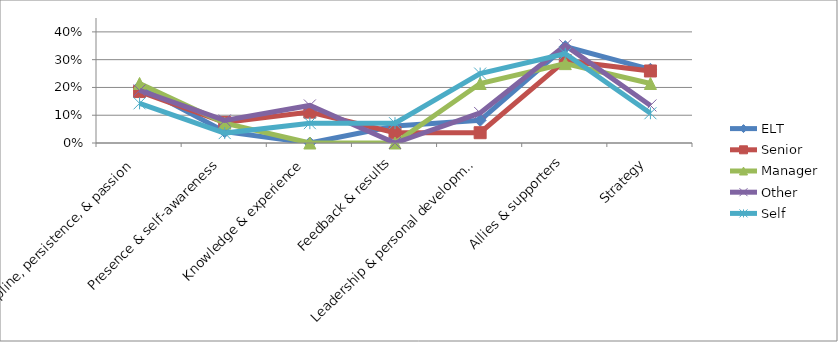
| Category | ELT | Senior | Manager | Other | Self |
|---|---|---|---|---|---|
| Discipline, persistence, & passion | 0.204 | 0.185 | 0.214 | 0.189 | 0.143 |
| Presence & self-awareness | 0.041 | 0.074 | 0.071 | 0.081 | 0.036 |
| Knowledge & experience | 0 | 0.111 | 0 | 0.135 | 0.071 |
| Feedback & results | 0.061 | 0.037 | 0 | 0 | 0.071 |
| Leadership & personal development | 0.082 | 0.037 | 0.214 | 0.108 | 0.25 |
| Allies & supporters | 0.347 | 0.296 | 0.286 | 0.351 | 0.321 |
| Strategy | 0.265 | 0.259 | 0.214 | 0.135 | 0.107 |